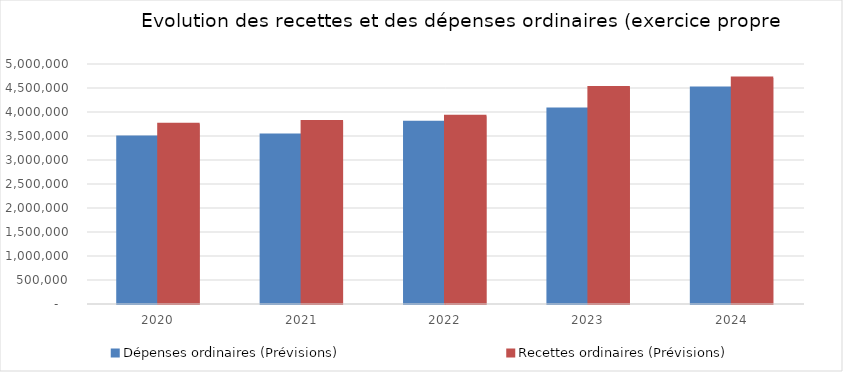
| Category | Dépenses ordinaires (Prévisions) | Recettes ordinaires (Prévisions) |
|---|---|---|
| 2020.0 | 3477208.75 | 3742475.44 |
| 2021.0 | 3519209.39 | 3801009.83 |
| 2022.0 | 3785617.7 | 3913148.44 |
| 2023.0 | 4061590.62 | 4509429.35 |
| 2024.0 | 4502577.45 | 4708071.19 |